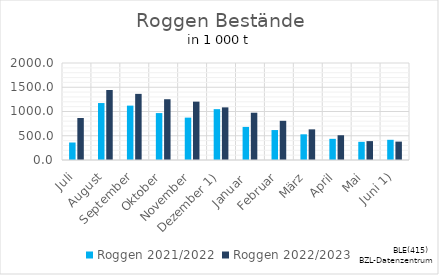
| Category | Roggen |
|---|---|
| Juli | 866.46 |
| August | 1443.263 |
| September | 1363.501 |
| Oktober | 1252.901 |
| November | 1203.22 |
| Dezember 1) | 1085.023 |
| Januar  | 974.862 |
| Februar | 808.14 |
| März | 631.822 |
| April | 510.438 |
| Mai | 389.467 |
| Juni 1) | 379.077 |